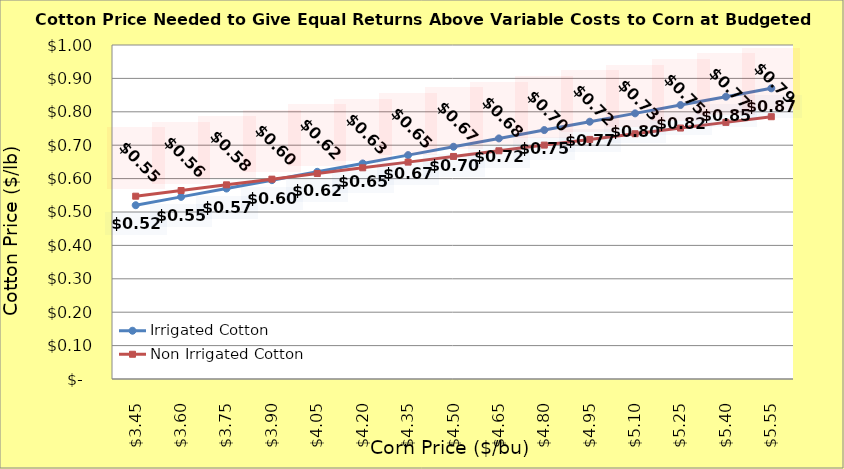
| Category | Irrigated Cotton | Non Irrigated Cotton |
|---|---|---|
| 3.4499999999999993 | 0.52 | 0.547 |
| 3.599999999999999 | 0.545 | 0.564 |
| 3.749999999999999 | 0.57 | 0.581 |
| 3.899999999999999 | 0.595 | 0.598 |
| 4.049999999999999 | 0.62 | 0.615 |
| 4.199999999999999 | 0.645 | 0.632 |
| 4.35 | 0.67 | 0.649 |
| 4.5 | 0.695 | 0.666 |
| 4.65 | 0.72 | 0.683 |
| 4.800000000000001 | 0.745 | 0.7 |
| 4.950000000000001 | 0.77 | 0.717 |
| 5.100000000000001 | 0.795 | 0.734 |
| 5.250000000000002 | 0.82 | 0.751 |
| 5.400000000000002 | 0.845 | 0.768 |
| 5.5500000000000025 | 0.87 | 0.785 |